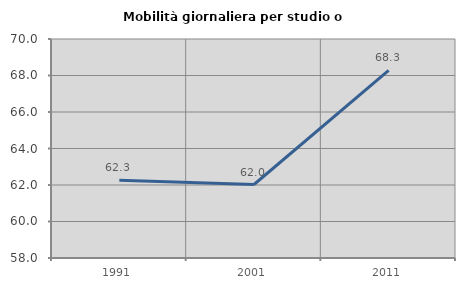
| Category | Mobilità giornaliera per studio o lavoro |
|---|---|
| 1991.0 | 62.262 |
| 2001.0 | 62.027 |
| 2011.0 | 68.278 |